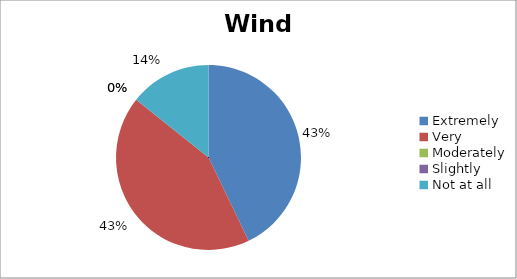
| Category | Wind |
|---|---|
| Extremely | 3 |
| Very | 3 |
| Moderately | 0 |
| Slightly | 0 |
| Not at all | 1 |